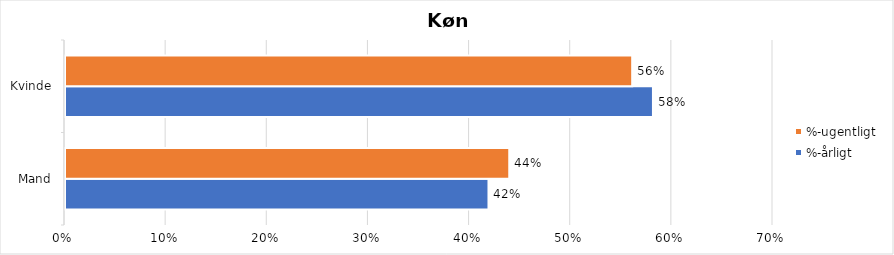
| Category | %-årligt | %-ugentligt |
|---|---|---|
| Mand | 0.419 | 0.439 |
| Kvinde | 0.581 | 0.561 |